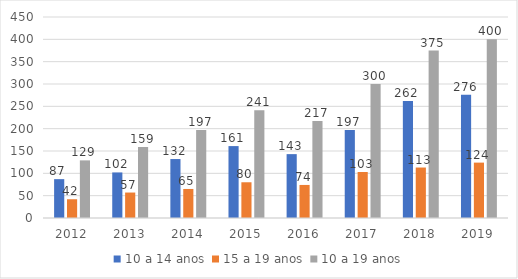
| Category | 10 a 14 anos | 15 a 19 anos | 10 a 19 anos |
|---|---|---|---|
| 2012 | 87 | 42 | 129 |
| 2013 | 102 | 57 | 159 |
| 2014 | 132 | 65 | 197 |
| 2015 | 161 | 80 | 241 |
| 2016 | 143 | 74 | 217 |
| 2017 | 197 | 103 | 300 |
| 2018 | 262 | 113 | 375 |
| 2019 | 276 | 124 | 400 |